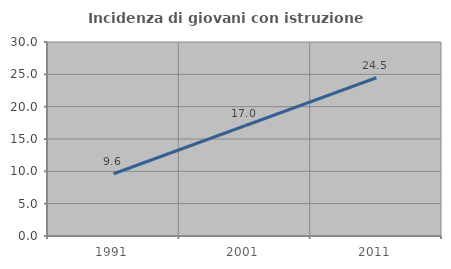
| Category | Incidenza di giovani con istruzione universitaria |
|---|---|
| 1991.0 | 9.627 |
| 2001.0 | 17.045 |
| 2011.0 | 24.476 |